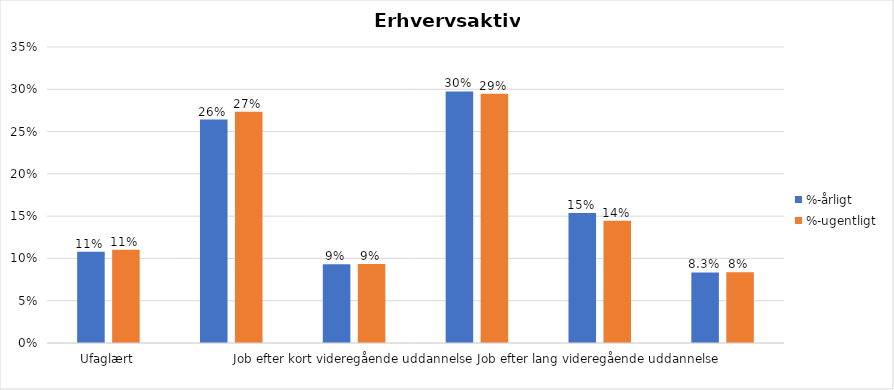
| Category | %-årligt | %-ugentligt |
|---|---|---|
| Ufaglært | 0.108 | 0.11 |
| Erhvervsfagligt job | 0.264 | 0.273 |
| Job efter kort videregående uddannelse | 0.093 | 0.093 |
| Job efter mellemlang videregående uddannelse | 0.297 | 0.295 |
| Job efter lang videregående uddannelse | 0.154 | 0.144 |
| Selvstændig | 0.083 | 0.084 |